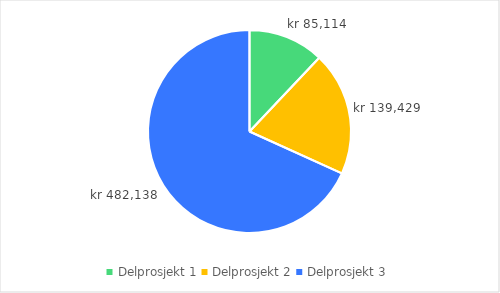
| Category | Series 0 |
|---|---|
| Delprosjekt 1 | 85113.791 |
| Delprosjekt 2 | 139428.639 |
| Delprosjekt 3 | 482137.912 |